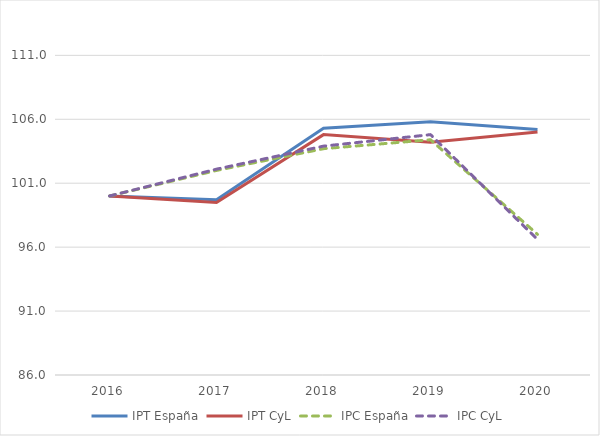
| Category | IPT España | IPT CyL | IPC España | IPC CyL |
|---|---|---|---|---|
| 2016.0 | 100 | 100 | 100 | 100 |
| 2017.0 | 99.7 | 99.5 | 102 | 102.1 |
| 2018.0 | 105.3 | 104.8 | 103.7 | 103.9 |
| 2019.0 | 105.8 | 104.2 | 104.4 | 104.8 |
| 2020.0 | 105.2 | 105 | 97 | 96.6 |